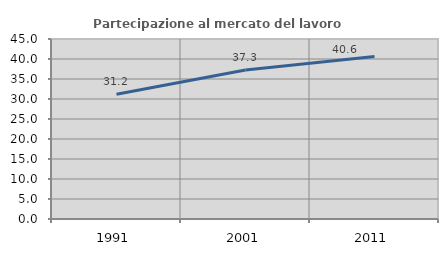
| Category | Partecipazione al mercato del lavoro  femminile |
|---|---|
| 1991.0 | 31.208 |
| 2001.0 | 37.271 |
| 2011.0 | 40.649 |